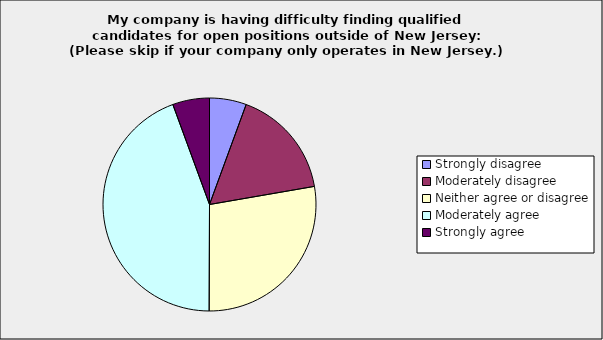
| Category | Series 0 |
|---|---|
| Strongly disagree | 0.056 |
| Moderately disagree | 0.167 |
| Neither agree or disagree | 0.278 |
| Moderately agree | 0.444 |
| Strongly agree | 0.056 |